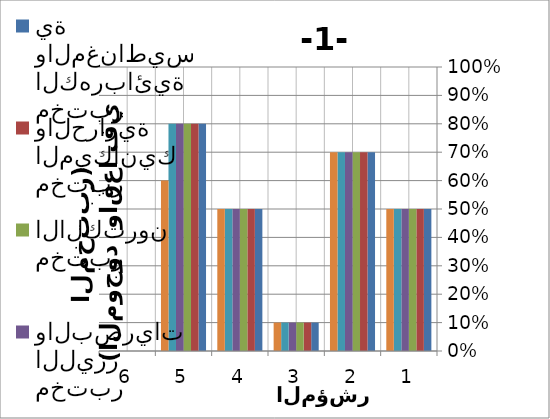
| Category | مختبر الكهربائية والمغناطيسية | مختبر الميكانيك والحرارية | مختبر الالكترون | مختبر الليزر والبصريات | مختبر الذرية والنووية | مختبر الصلبة |
|---|---|---|---|---|---|---|
| 0 | 0.5 | 0.5 | 0.5 | 0.5 | 0.5 | 0.5 |
| 1 | 0.7 | 0.7 | 0.7 | 0.7 | 0.7 | 0.7 |
| 2 | 0.1 | 0.1 | 0.1 | 0.1 | 0.1 | 0.1 |
| 3 | 0.5 | 0.5 | 0.5 | 0.5 | 0.5 | 0.5 |
| 4 | 0.8 | 0.8 | 0.8 | 0.8 | 0.8 | 0.6 |
| 5 | 0 | 0 | 0 | 0 | 0 | 0 |